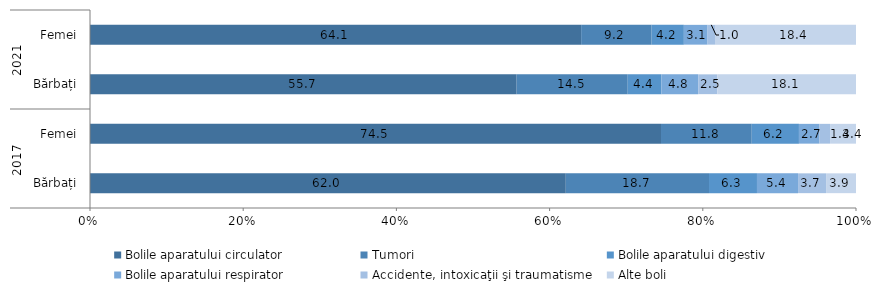
| Category | Bolile aparatului circulator | Tumori | Bolile aparatului digestiv | Bolile aparatului respirator | Accidente, intoxicaţii şi traumatisme | Alte boli |
|---|---|---|---|---|---|---|
| 0 | 62.024 | 18.67 | 6.251 | 5.355 | 3.654 | 3.9 |
| 1 | 74.518 | 11.842 | 6.159 | 2.687 | 1.374 | 3.384 |
| 2 | 55.7 | 14.5 | 4.4 | 4.8 | 2.5 | 18.1 |
| 3 | 64.1 | 9.2 | 4.209 | 3.094 | 0.971 | 18.4 |